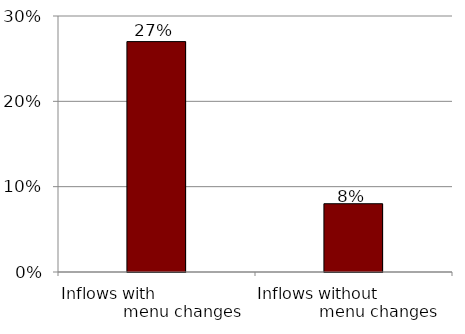
| Category | Series 0 |
|---|---|
| Inflows with                              menu changes | 0.27 |
| Inflows without                         menu changes | 0.08 |